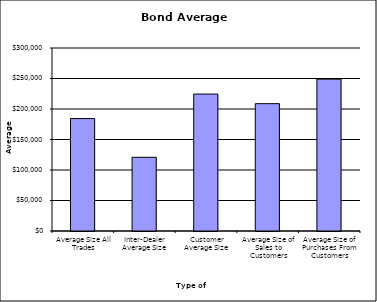
| Category | Security Type |
|---|---|
| Average Size All Trades | 184347.285 |
| Inter-Dealer Average Size | 120840.361 |
| Customer Average Size | 224473.351 |
| Average Size of Sales to Customers | 208759.528 |
| Average Size of Purchases From Customers | 249000.839 |